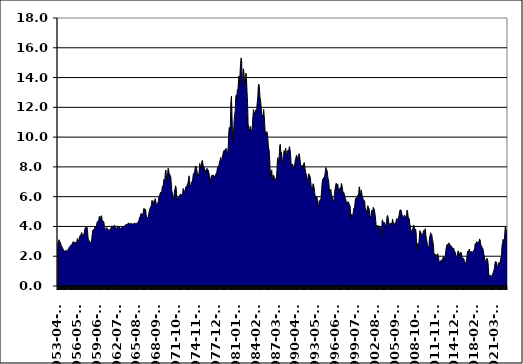
| Category | Series 0 |
|---|---|
| 1953-04-01 | 2.83 |
| 1953-05-01 | 3.05 |
| 1953-06-01 | 3.11 |
| 1953-07-01 | 2.93 |
| 1953-08-01 | 2.95 |
| 1953-09-01 | 2.87 |
| 1953-10-01 | 2.66 |
| 1953-11-01 | 2.68 |
| 1953-12-01 | 2.59 |
| 1954-01-01 | 2.48 |
| 1954-02-01 | 2.47 |
| 1954-03-01 | 2.37 |
| 1954-04-01 | 2.29 |
| 1954-05-01 | 2.37 |
| 1954-06-01 | 2.38 |
| 1954-07-01 | 2.3 |
| 1954-08-01 | 2.36 |
| 1954-09-01 | 2.38 |
| 1954-10-01 | 2.43 |
| 1954-11-01 | 2.48 |
| 1954-12-01 | 2.51 |
| 1955-01-01 | 2.61 |
| 1955-02-01 | 2.65 |
| 1955-03-01 | 2.68 |
| 1955-04-01 | 2.75 |
| 1955-05-01 | 2.76 |
| 1955-06-01 | 2.78 |
| 1955-07-01 | 2.9 |
| 1955-08-01 | 2.97 |
| 1955-09-01 | 2.97 |
| 1955-10-01 | 2.88 |
| 1955-11-01 | 2.89 |
| 1955-12-01 | 2.96 |
| 1956-01-01 | 2.9 |
| 1956-02-01 | 2.84 |
| 1956-03-01 | 2.96 |
| 1956-04-01 | 3.18 |
| 1956-05-01 | 3.07 |
| 1956-06-01 | 3 |
| 1956-07-01 | 3.11 |
| 1956-08-01 | 3.33 |
| 1956-09-01 | 3.38 |
| 1956-10-01 | 3.34 |
| 1956-11-01 | 3.49 |
| 1956-12-01 | 3.59 |
| 1957-01-01 | 3.46 |
| 1957-02-01 | 3.34 |
| 1957-03-01 | 3.41 |
| 1957-04-01 | 3.48 |
| 1957-05-01 | 3.6 |
| 1957-06-01 | 3.8 |
| 1957-07-01 | 3.93 |
| 1957-08-01 | 3.93 |
| 1957-09-01 | 3.92 |
| 1957-10-01 | 3.97 |
| 1957-11-01 | 3.72 |
| 1957-12-01 | 3.21 |
| 1958-01-01 | 3.09 |
| 1958-02-01 | 3.05 |
| 1958-03-01 | 2.98 |
| 1958-04-01 | 2.88 |
| 1958-05-01 | 2.92 |
| 1958-06-01 | 2.97 |
| 1958-07-01 | 3.2 |
| 1958-08-01 | 3.54 |
| 1958-09-01 | 3.76 |
| 1958-10-01 | 3.8 |
| 1958-11-01 | 3.74 |
| 1958-12-01 | 3.86 |
| 1959-01-01 | 4.02 |
| 1959-02-01 | 3.96 |
| 1959-03-01 | 3.99 |
| 1959-04-01 | 4.12 |
| 1959-05-01 | 4.31 |
| 1959-06-01 | 4.34 |
| 1959-07-01 | 4.4 |
| 1959-08-01 | 4.43 |
| 1959-09-01 | 4.68 |
| 1959-10-01 | 4.53 |
| 1959-11-01 | 4.53 |
| 1959-12-01 | 4.69 |
| 1960-01-01 | 4.72 |
| 1960-02-01 | 4.49 |
| 1960-03-01 | 4.25 |
| 1960-04-01 | 4.28 |
| 1960-05-01 | 4.35 |
| 1960-06-01 | 4.15 |
| 1960-07-01 | 3.9 |
| 1960-08-01 | 3.8 |
| 1960-09-01 | 3.8 |
| 1960-10-01 | 3.89 |
| 1960-11-01 | 3.93 |
| 1960-12-01 | 3.84 |
| 1961-01-01 | 3.84 |
| 1961-02-01 | 3.78 |
| 1961-03-01 | 3.74 |
| 1961-04-01 | 3.78 |
| 1961-05-01 | 3.71 |
| 1961-06-01 | 3.88 |
| 1961-07-01 | 3.92 |
| 1961-08-01 | 4.04 |
| 1961-09-01 | 3.98 |
| 1961-10-01 | 3.92 |
| 1961-11-01 | 3.94 |
| 1961-12-01 | 4.06 |
| 1962-01-01 | 4.08 |
| 1962-02-01 | 4.04 |
| 1962-03-01 | 3.93 |
| 1962-04-01 | 3.84 |
| 1962-05-01 | 3.87 |
| 1962-06-01 | 3.91 |
| 1962-07-01 | 4.01 |
| 1962-08-01 | 3.98 |
| 1962-09-01 | 3.98 |
| 1962-10-01 | 3.93 |
| 1962-11-01 | 3.92 |
| 1962-12-01 | 3.86 |
| 1963-01-01 | 3.83 |
| 1963-02-01 | 3.92 |
| 1963-03-01 | 3.93 |
| 1963-04-01 | 3.97 |
| 1963-05-01 | 3.93 |
| 1963-06-01 | 3.99 |
| 1963-07-01 | 4.02 |
| 1963-08-01 | 4 |
| 1963-09-01 | 4.08 |
| 1963-10-01 | 4.11 |
| 1963-11-01 | 4.12 |
| 1963-12-01 | 4.13 |
| 1964-01-01 | 4.17 |
| 1964-02-01 | 4.15 |
| 1964-03-01 | 4.22 |
| 1964-04-01 | 4.23 |
| 1964-05-01 | 4.2 |
| 1964-06-01 | 4.17 |
| 1964-07-01 | 4.19 |
| 1964-08-01 | 4.19 |
| 1964-09-01 | 4.2 |
| 1964-10-01 | 4.19 |
| 1964-11-01 | 4.15 |
| 1964-12-01 | 4.18 |
| 1965-01-01 | 4.19 |
| 1965-02-01 | 4.21 |
| 1965-03-01 | 4.21 |
| 1965-04-01 | 4.2 |
| 1965-05-01 | 4.21 |
| 1965-06-01 | 4.21 |
| 1965-07-01 | 4.2 |
| 1965-08-01 | 4.25 |
| 1965-09-01 | 4.29 |
| 1965-10-01 | 4.35 |
| 1965-11-01 | 4.45 |
| 1965-12-01 | 4.62 |
| 1966-01-01 | 4.61 |
| 1966-02-01 | 4.83 |
| 1966-03-01 | 4.87 |
| 1966-04-01 | 4.75 |
| 1966-05-01 | 4.78 |
| 1966-06-01 | 4.81 |
| 1966-07-01 | 5.02 |
| 1966-08-01 | 5.22 |
| 1966-09-01 | 5.18 |
| 1966-10-01 | 5.01 |
| 1966-11-01 | 5.16 |
| 1966-12-01 | 4.84 |
| 1967-01-01 | 4.58 |
| 1967-02-01 | 4.63 |
| 1967-03-01 | 4.54 |
| 1967-04-01 | 4.59 |
| 1967-05-01 | 4.85 |
| 1967-06-01 | 5.02 |
| 1967-07-01 | 5.16 |
| 1967-08-01 | 5.28 |
| 1967-09-01 | 5.3 |
| 1967-10-01 | 5.48 |
| 1967-11-01 | 5.75 |
| 1967-12-01 | 5.7 |
| 1968-01-01 | 5.53 |
| 1968-02-01 | 5.56 |
| 1968-03-01 | 5.74 |
| 1968-04-01 | 5.64 |
| 1968-05-01 | 5.87 |
| 1968-06-01 | 5.72 |
| 1968-07-01 | 5.5 |
| 1968-08-01 | 5.42 |
| 1968-09-01 | 5.46 |
| 1968-10-01 | 5.58 |
| 1968-11-01 | 5.7 |
| 1968-12-01 | 6.03 |
| 1969-01-01 | 6.04 |
| 1969-02-01 | 6.19 |
| 1969-03-01 | 6.3 |
| 1969-04-01 | 6.17 |
| 1969-05-01 | 6.32 |
| 1969-06-01 | 6.57 |
| 1969-07-01 | 6.72 |
| 1969-08-01 | 6.69 |
| 1969-09-01 | 7.16 |
| 1969-10-01 | 7.1 |
| 1969-11-01 | 7.14 |
| 1969-12-01 | 7.65 |
| 1970-01-01 | 7.79 |
| 1970-02-01 | 7.24 |
| 1970-03-01 | 7.07 |
| 1970-04-01 | 7.39 |
| 1970-05-01 | 7.91 |
| 1970-06-01 | 7.84 |
| 1970-07-01 | 7.46 |
| 1970-08-01 | 7.53 |
| 1970-09-01 | 7.39 |
| 1970-10-01 | 7.33 |
| 1970-11-01 | 6.84 |
| 1970-12-01 | 6.39 |
| 1971-01-01 | 6.24 |
| 1971-02-01 | 6.11 |
| 1971-03-01 | 5.7 |
| 1971-04-01 | 5.83 |
| 1971-05-01 | 6.39 |
| 1971-06-01 | 6.52 |
| 1971-07-01 | 6.73 |
| 1971-08-01 | 6.58 |
| 1971-09-01 | 6.14 |
| 1971-10-01 | 5.93 |
| 1971-11-01 | 5.81 |
| 1971-12-01 | 5.93 |
| 1972-01-01 | 5.95 |
| 1972-02-01 | 6.08 |
| 1972-03-01 | 6.07 |
| 1972-04-01 | 6.19 |
| 1972-05-01 | 6.13 |
| 1972-06-01 | 6.11 |
| 1972-07-01 | 6.11 |
| 1972-08-01 | 6.21 |
| 1972-09-01 | 6.55 |
| 1972-10-01 | 6.48 |
| 1972-11-01 | 6.28 |
| 1972-12-01 | 6.36 |
| 1973-01-01 | 6.46 |
| 1973-02-01 | 6.64 |
| 1973-03-01 | 6.71 |
| 1973-04-01 | 6.67 |
| 1973-05-01 | 6.85 |
| 1973-06-01 | 6.9 |
| 1973-07-01 | 7.13 |
| 1973-08-01 | 7.4 |
| 1973-09-01 | 7.09 |
| 1973-10-01 | 6.79 |
| 1973-11-01 | 6.73 |
| 1973-12-01 | 6.74 |
| 1974-01-01 | 6.99 |
| 1974-02-01 | 6.96 |
| 1974-03-01 | 7.21 |
| 1974-04-01 | 7.51 |
| 1974-05-01 | 7.58 |
| 1974-06-01 | 7.54 |
| 1974-07-01 | 7.81 |
| 1974-08-01 | 8.04 |
| 1974-09-01 | 8.04 |
| 1974-10-01 | 7.9 |
| 1974-11-01 | 7.68 |
| 1974-12-01 | 7.43 |
| 1975-01-01 | 7.5 |
| 1975-02-01 | 7.39 |
| 1975-03-01 | 7.73 |
| 1975-04-01 | 8.23 |
| 1975-05-01 | 8.06 |
| 1975-06-01 | 7.86 |
| 1975-07-01 | 8.06 |
| 1975-08-01 | 8.4 |
| 1975-09-01 | 8.43 |
| 1975-10-01 | 8.14 |
| 1975-11-01 | 8.05 |
| 1975-12-01 | 8 |
| 1976-01-01 | 7.74 |
| 1976-02-01 | 7.79 |
| 1976-03-01 | 7.73 |
| 1976-04-01 | 7.56 |
| 1976-05-01 | 7.9 |
| 1976-06-01 | 7.86 |
| 1976-07-01 | 7.83 |
| 1976-08-01 | 7.77 |
| 1976-09-01 | 7.59 |
| 1976-10-01 | 7.41 |
| 1976-11-01 | 7.29 |
| 1976-12-01 | 6.87 |
| 1977-01-01 | 7.21 |
| 1977-02-01 | 7.39 |
| 1977-03-01 | 7.46 |
| 1977-04-01 | 7.37 |
| 1977-05-01 | 7.46 |
| 1977-06-01 | 7.28 |
| 1977-07-01 | 7.33 |
| 1977-08-01 | 7.4 |
| 1977-09-01 | 7.34 |
| 1977-10-01 | 7.52 |
| 1977-11-01 | 7.58 |
| 1977-12-01 | 7.69 |
| 1978-01-01 | 7.96 |
| 1978-02-01 | 8.03 |
| 1978-03-01 | 8.04 |
| 1978-04-01 | 8.15 |
| 1978-05-01 | 8.35 |
| 1978-06-01 | 8.46 |
| 1978-07-01 | 8.64 |
| 1978-08-01 | 8.41 |
| 1978-09-01 | 8.42 |
| 1978-10-01 | 8.64 |
| 1978-11-01 | 8.81 |
| 1978-12-01 | 9.01 |
| 1979-01-01 | 9.1 |
| 1979-02-01 | 9.1 |
| 1979-03-01 | 9.12 |
| 1979-04-01 | 9.18 |
| 1979-05-01 | 9.25 |
| 1979-06-01 | 8.91 |
| 1979-07-01 | 8.95 |
| 1979-08-01 | 9.03 |
| 1979-09-01 | 9.33 |
| 1979-10-01 | 10.3 |
| 1979-11-01 | 10.65 |
| 1979-12-01 | 10.39 |
| 1980-01-01 | 10.8 |
| 1980-02-01 | 12.41 |
| 1980-03-01 | 12.75 |
| 1980-04-01 | 11.47 |
| 1980-05-01 | 10.18 |
| 1980-06-01 | 9.78 |
| 1980-07-01 | 10.25 |
| 1980-08-01 | 11.1 |
| 1980-09-01 | 11.51 |
| 1980-10-01 | 11.75 |
| 1980-11-01 | 12.68 |
| 1980-12-01 | 12.84 |
| 1981-01-01 | 12.57 |
| 1981-02-01 | 13.19 |
| 1981-03-01 | 13.12 |
| 1981-04-01 | 13.68 |
| 1981-05-01 | 14.1 |
| 1981-06-01 | 13.47 |
| 1981-07-01 | 14.28 |
| 1981-08-01 | 14.94 |
| 1981-09-01 | 15.32 |
| 1981-10-01 | 15.15 |
| 1981-11-01 | 13.39 |
| 1981-12-01 | 13.72 |
| 1982-01-01 | 14.59 |
| 1982-02-01 | 14.43 |
| 1982-03-01 | 13.86 |
| 1982-04-01 | 13.87 |
| 1982-05-01 | 13.62 |
| 1982-06-01 | 14.3 |
| 1982-07-01 | 13.95 |
| 1982-08-01 | 13.06 |
| 1982-09-01 | 12.34 |
| 1982-10-01 | 10.91 |
| 1982-11-01 | 10.55 |
| 1982-12-01 | 10.54 |
| 1983-01-01 | 10.46 |
| 1983-02-01 | 10.72 |
| 1983-03-01 | 10.51 |
| 1983-04-01 | 10.4 |
| 1983-05-01 | 10.38 |
| 1983-06-01 | 10.85 |
| 1983-07-01 | 11.38 |
| 1983-08-01 | 11.85 |
| 1983-09-01 | 11.65 |
| 1983-10-01 | 11.54 |
| 1983-11-01 | 11.69 |
| 1983-12-01 | 11.83 |
| 1984-01-01 | 11.67 |
| 1984-02-01 | 11.84 |
| 1984-03-01 | 12.32 |
| 1984-04-01 | 12.63 |
| 1984-05-01 | 13.41 |
| 1984-06-01 | 13.56 |
| 1984-07-01 | 13.36 |
| 1984-08-01 | 12.72 |
| 1984-09-01 | 12.52 |
| 1984-10-01 | 12.16 |
| 1984-11-01 | 11.57 |
| 1984-12-01 | 11.5 |
| 1985-01-01 | 11.38 |
| 1985-02-01 | 11.51 |
| 1985-03-01 | 11.86 |
| 1985-04-01 | 11.43 |
| 1985-05-01 | 10.85 |
| 1985-06-01 | 10.16 |
| 1985-07-01 | 10.31 |
| 1985-08-01 | 10.33 |
| 1985-09-01 | 10.37 |
| 1985-10-01 | 10.24 |
| 1985-11-01 | 9.78 |
| 1985-12-01 | 9.26 |
| 1986-01-01 | 9.19 |
| 1986-02-01 | 8.7 |
| 1986-03-01 | 7.78 |
| 1986-04-01 | 7.3 |
| 1986-05-01 | 7.71 |
| 1986-06-01 | 7.8 |
| 1986-07-01 | 7.3 |
| 1986-08-01 | 7.17 |
| 1986-09-01 | 7.45 |
| 1986-10-01 | 7.43 |
| 1986-11-01 | 7.25 |
| 1986-12-01 | 7.11 |
| 1987-01-01 | 7.08 |
| 1987-02-01 | 7.25 |
| 1987-03-01 | 7.25 |
| 1987-04-01 | 8.02 |
| 1987-05-01 | 8.61 |
| 1987-06-01 | 8.4 |
| 1987-07-01 | 8.45 |
| 1987-08-01 | 8.76 |
| 1987-09-01 | 9.42 |
| 1987-10-01 | 9.52 |
| 1987-11-01 | 8.86 |
| 1987-12-01 | 8.99 |
| 1988-01-01 | 8.67 |
| 1988-02-01 | 8.21 |
| 1988-03-01 | 8.37 |
| 1988-04-01 | 8.72 |
| 1988-05-01 | 9.09 |
| 1988-06-01 | 8.92 |
| 1988-07-01 | 9.06 |
| 1988-08-01 | 9.26 |
| 1988-09-01 | 8.98 |
| 1988-10-01 | 8.8 |
| 1988-11-01 | 8.96 |
| 1988-12-01 | 9.11 |
| 1989-01-01 | 9.09 |
| 1989-02-01 | 9.17 |
| 1989-03-01 | 9.36 |
| 1989-04-01 | 9.18 |
| 1989-05-01 | 8.86 |
| 1989-06-01 | 8.28 |
| 1989-07-01 | 8.02 |
| 1989-08-01 | 8.11 |
| 1989-09-01 | 8.19 |
| 1989-10-01 | 8.01 |
| 1989-11-01 | 7.87 |
| 1989-12-01 | 7.84 |
| 1990-01-01 | 8.21 |
| 1990-02-01 | 8.47 |
| 1990-03-01 | 8.59 |
| 1990-04-01 | 8.79 |
| 1990-05-01 | 8.76 |
| 1990-06-01 | 8.48 |
| 1990-07-01 | 8.47 |
| 1990-08-01 | 8.75 |
| 1990-09-01 | 8.89 |
| 1990-10-01 | 8.72 |
| 1990-11-01 | 8.39 |
| 1990-12-01 | 8.08 |
| 1991-01-01 | 8.09 |
| 1991-02-01 | 7.85 |
| 1991-03-01 | 8.11 |
| 1991-04-01 | 8.04 |
| 1991-05-01 | 8.07 |
| 1991-06-01 | 8.28 |
| 1991-07-01 | 8.27 |
| 1991-08-01 | 7.9 |
| 1991-09-01 | 7.65 |
| 1991-10-01 | 7.53 |
| 1991-11-01 | 7.42 |
| 1991-12-01 | 7.09 |
| 1992-01-01 | 7.03 |
| 1992-02-01 | 7.34 |
| 1992-03-01 | 7.54 |
| 1992-04-01 | 7.48 |
| 1992-05-01 | 7.39 |
| 1992-06-01 | 7.26 |
| 1992-07-01 | 6.84 |
| 1992-08-01 | 6.59 |
| 1992-09-01 | 6.42 |
| 1992-10-01 | 6.59 |
| 1992-11-01 | 6.87 |
| 1992-12-01 | 6.77 |
| 1993-01-01 | 6.6 |
| 1993-02-01 | 6.26 |
| 1993-03-01 | 5.98 |
| 1993-04-01 | 5.97 |
| 1993-05-01 | 6.04 |
| 1993-06-01 | 5.96 |
| 1993-07-01 | 5.81 |
| 1993-08-01 | 5.68 |
| 1993-09-01 | 5.36 |
| 1993-10-01 | 5.33 |
| 1993-11-01 | 5.72 |
| 1993-12-01 | 5.77 |
| 1994-01-01 | 5.75 |
| 1994-02-01 | 5.97 |
| 1994-03-01 | 6.48 |
| 1994-04-01 | 6.97 |
| 1994-05-01 | 7.18 |
| 1994-06-01 | 7.1 |
| 1994-07-01 | 7.3 |
| 1994-08-01 | 7.24 |
| 1994-09-01 | 7.46 |
| 1994-10-01 | 7.74 |
| 1994-11-01 | 7.96 |
| 1994-12-01 | 7.81 |
| 1995-01-01 | 7.78 |
| 1995-02-01 | 7.47 |
| 1995-03-01 | 7.2 |
| 1995-04-01 | 7.06 |
| 1995-05-01 | 6.63 |
| 1995-06-01 | 6.17 |
| 1995-07-01 | 6.28 |
| 1995-08-01 | 6.49 |
| 1995-09-01 | 6.2 |
| 1995-10-01 | 6.04 |
| 1995-11-01 | 5.93 |
| 1995-12-01 | 5.71 |
| 1996-01-01 | 5.65 |
| 1996-02-01 | 5.81 |
| 1996-03-01 | 6.27 |
| 1996-04-01 | 6.51 |
| 1996-05-01 | 6.74 |
| 1996-06-01 | 6.91 |
| 1996-07-01 | 6.87 |
| 1996-08-01 | 6.64 |
| 1996-09-01 | 6.83 |
| 1996-10-01 | 6.53 |
| 1996-11-01 | 6.2 |
| 1996-12-01 | 6.3 |
| 1997-01-01 | 6.58 |
| 1997-02-01 | 6.42 |
| 1997-03-01 | 6.69 |
| 1997-04-01 | 6.89 |
| 1997-05-01 | 6.71 |
| 1997-06-01 | 6.49 |
| 1997-07-01 | 6.22 |
| 1997-08-01 | 6.3 |
| 1997-09-01 | 6.21 |
| 1997-10-01 | 6.03 |
| 1997-11-01 | 5.88 |
| 1997-12-01 | 5.81 |
| 1998-01-01 | 5.54 |
| 1998-02-01 | 5.57 |
| 1998-03-01 | 5.65 |
| 1998-04-01 | 5.64 |
| 1998-05-01 | 5.65 |
| 1998-06-01 | 5.5 |
| 1998-07-01 | 5.46 |
| 1998-08-01 | 5.34 |
| 1998-09-01 | 4.81 |
| 1998-10-01 | 4.53 |
| 1998-11-01 | 4.83 |
| 1998-12-01 | 4.65 |
| 1999-01-01 | 4.72 |
| 1999-02-01 | 5 |
| 1999-03-01 | 5.23 |
| 1999-04-01 | 5.18 |
| 1999-05-01 | 5.54 |
| 1999-06-01 | 5.9 |
| 1999-07-01 | 5.79 |
| 1999-08-01 | 5.94 |
| 1999-09-01 | 5.92 |
| 1999-10-01 | 6.11 |
| 1999-11-01 | 6.03 |
| 1999-12-01 | 6.28 |
| 2000-01-01 | 6.66 |
| 2000-02-01 | 6.52 |
| 2000-03-01 | 6.26 |
| 2000-04-01 | 5.99 |
| 2000-05-01 | 6.44 |
| 2000-06-01 | 6.1 |
| 2000-07-01 | 6.05 |
| 2000-08-01 | 5.83 |
| 2000-09-01 | 5.8 |
| 2000-10-01 | 5.74 |
| 2000-11-01 | 5.72 |
| 2000-12-01 | 5.24 |
| 2001-01-01 | 5.16 |
| 2001-02-01 | 5.1 |
| 2001-03-01 | 4.89 |
| 2001-04-01 | 5.14 |
| 2001-05-01 | 5.39 |
| 2001-06-01 | 5.28 |
| 2001-07-01 | 5.24 |
| 2001-08-01 | 4.97 |
| 2001-09-01 | 4.73 |
| 2001-10-01 | 4.57 |
| 2001-11-01 | 4.65 |
| 2001-12-01 | 5.09 |
| 2002-01-01 | 5.04 |
| 2002-02-01 | 4.91 |
| 2002-03-01 | 5.28 |
| 2002-04-01 | 5.21 |
| 2002-05-01 | 5.16 |
| 2002-06-01 | 4.93 |
| 2002-07-01 | 4.65 |
| 2002-08-01 | 4.26 |
| 2002-09-01 | 3.87 |
| 2002-10-01 | 3.94 |
| 2002-11-01 | 4.05 |
| 2002-12-01 | 4.03 |
| 2003-01-01 | 4.05 |
| 2003-02-01 | 3.9 |
| 2003-03-01 | 3.81 |
| 2003-04-01 | 3.96 |
| 2003-05-01 | 3.57 |
| 2003-06-01 | 3.33 |
| 2003-07-01 | 3.98 |
| 2003-08-01 | 4.45 |
| 2003-09-01 | 4.27 |
| 2003-10-01 | 4.29 |
| 2003-11-01 | 4.3 |
| 2003-12-01 | 4.27 |
| 2004-01-01 | 4.15 |
| 2004-02-01 | 4.08 |
| 2004-03-01 | 3.98 |
| 2004-04-01 | 4.35 |
| 2004-05-01 | 4.72 |
| 2004-06-01 | 4.73 |
| 2004-07-01 | 4.5 |
| 2004-08-01 | 4.28 |
| 2004-09-01 | 4.13 |
| 2004-10-01 | 4.1 |
| 2004-11-01 | 4.19 |
| 2004-12-01 | 4.23 |
| 2005-01-01 | 4.22 |
| 2005-02-01 | 4.17 |
| 2005-03-01 | 4.5 |
| 2005-04-01 | 4.34 |
| 2005-05-01 | 4.14 |
| 2005-06-01 | 4 |
| 2005-07-01 | 4.18 |
| 2005-08-01 | 4.26 |
| 2005-09-01 | 4.2 |
| 2005-10-01 | 4.46 |
| 2005-11-01 | 4.54 |
| 2005-12-01 | 4.47 |
| 2006-01-01 | 4.42 |
| 2006-02-01 | 4.57 |
| 2006-03-01 | 4.72 |
| 2006-04-01 | 4.99 |
| 2006-05-01 | 5.11 |
| 2006-06-01 | 5.11 |
| 2006-07-01 | 5.09 |
| 2006-08-01 | 4.88 |
| 2006-09-01 | 4.72 |
| 2006-10-01 | 4.73 |
| 2006-11-01 | 4.6 |
| 2006-12-01 | 4.56 |
| 2007-01-01 | 4.76 |
| 2007-02-01 | 4.72 |
| 2007-03-01 | 4.56 |
| 2007-04-01 | 4.69 |
| 2007-05-01 | 4.75 |
| 2007-06-01 | 5.1 |
| 2007-07-01 | 5 |
| 2007-08-01 | 4.67 |
| 2007-09-01 | 4.52 |
| 2007-10-01 | 4.53 |
| 2007-11-01 | 4.15 |
| 2007-12-01 | 4.1 |
| 2008-01-01 | 3.74 |
| 2008-02-01 | 3.74 |
| 2008-03-01 | 3.51 |
| 2008-04-01 | 3.68 |
| 2008-05-01 | 3.88 |
| 2008-06-01 | 4.1 |
| 2008-07-01 | 4.01 |
| 2008-08-01 | 3.89 |
| 2008-09-01 | 3.69 |
| 2008-10-01 | 3.81 |
| 2008-11-01 | 3.53 |
| 2008-12-01 | 2.42 |
| 2009-01-01 | 2.52 |
| 2009-02-01 | 2.87 |
| 2009-03-01 | 2.82 |
| 2009-04-01 | 2.93 |
| 2009-05-01 | 3.29 |
| 2009-06-01 | 3.72 |
| 2009-07-01 | 3.56 |
| 2009-08-01 | 3.59 |
| 2009-09-01 | 3.4 |
| 2009-10-01 | 3.39 |
| 2009-11-01 | 3.4 |
| 2009-12-01 | 3.59 |
| 2010-01-01 | 3.73 |
| 2010-02-01 | 3.69 |
| 2010-03-01 | 3.73 |
| 2010-04-01 | 3.85 |
| 2010-05-01 | 3.42 |
| 2010-06-01 | 3.2 |
| 2010-07-01 | 3.01 |
| 2010-08-01 | 2.7 |
| 2010-09-01 | 2.6 |
| 2010-10-01 | 2.54 |
| 2010-11-01 | 2.76 |
| 2010-12-01 | 3.29 |
| 2011-01-01 | 3.39 |
| 2011-02-01 | 3.58 |
| 2011-03-01 | 3.41 |
| 2011-04-01 | 3.46 |
| 2011-05-01 | 3.17 |
| 2011-06-01 | 3 |
| 2011-07-01 | 2.8 |
| 2011-08-01 | 2.25 |
| 2011-09-01 | 2 |
| 2011-10-01 | 2.15 |
| 2011-11-01 | 2.05 |
| 2011-12-01 | 2.11 |
| 2012-01-01 | 1.97 |
| 2012-02-01 | 1.97 |
| 2012-03-01 | 2.17 |
| 2012-04-01 | 2.05 |
| 2012-05-01 | 1.8 |
| 2012-06-01 | 1.62 |
| 2012-07-01 | 1.53 |
| 2012-08-01 | 1.68 |
| 2012-09-01 | 1.72 |
| 2012-10-01 | 1.75 |
| 2012-11-01 | 1.65 |
| 2012-12-01 | 1.72 |
| 2013-01-01 | 1.91 |
| 2013-02-01 | 1.98 |
| 2013-03-01 | 1.96 |
| 2013-04-01 | 1.76 |
| 2013-05-01 | 1.93 |
| 2013-06-01 | 2.3 |
| 2013-07-01 | 2.58 |
| 2013-08-01 | 2.74 |
| 2013-09-01 | 2.81 |
| 2013-10-01 | 2.62 |
| 2013-11-01 | 2.72 |
| 2013-12-01 | 2.9 |
| 2014-01-01 | 2.86 |
| 2014-02-01 | 2.71 |
| 2014-03-01 | 2.72 |
| 2014-04-01 | 2.71 |
| 2014-05-01 | 2.56 |
| 2014-06-01 | 2.6 |
| 2014-07-01 | 2.54 |
| 2014-08-01 | 2.42 |
| 2014-09-01 | 2.53 |
| 2014-10-01 | 2.3 |
| 2014-11-01 | 2.33 |
| 2014-12-01 | 2.21 |
| 2015-02-01 | 1.98 |
| 2015-03-01 | 1.88 |
| 2015-04-01 | 1.94 |
| 2015-05-01 | 2.2 |
| 2015-06-01 | 2.36 |
| 2015-07-01 | 2.32 |
| 2015-08-01 | 2.17 |
| 2015-09-01 | 2.17 |
| 2015-10-01 | 2.07 |
| 2015-11-01 | 2.26 |
| 2015-12-01 | 2.24 |
| 2016-01-01 | 2 |
| 2016-02-01 | 1.78 |
| 2016-03-01 | 1.89 |
| 2016-04-01 | 1.81 |
| 2016-05-01 | 1.81 |
| 2016-06-01 | 1.64 |
| 2016-07-01 | 1.5 |
| 2016-08-01 | 1.56 |
| 2016-09-01 | 1.63 |
| 2016-10-01 | 1.76 |
| 2016-11-01 | 2.14 |
| 2016-12-01 | 2.34 |
| 2017-01-01 | 2.28 |
| 2017-02-01 | 2.4 |
| 2017-03-01 | 2.48 |
| 2017-04-01 | 2.3 |
| 2017-05-01 | 2.304 |
| 2017-06-01 | 2.187 |
| 2017-07-01 | 2.318 |
| 2017-08-01 | 2.209 |
| 2017-09-01 | 2.202 |
| 2017-10-01 | 2.36 |
| 2017-11-01 | 2.353 |
| 2017-12-01 | 2.402 |
| 2018-01-01 | 2.584 |
| 2018-02-01 | 2.859 |
| 2018-03-01 | 2.842 |
| 2018-04-01 | 2.869 |
| 2018-05-01 | 2.978 |
| 2018-06-01 | 2.912 |
| 2018-07-01 | 2.889 |
| 2018-08-01 | 2.889 |
| 2018-09-01 | 3.004 |
| 2018-10-01 | 3.152 |
| 2018-11-01 | 3.117 |
| 2018-12-01 | 2.833 |
| 2019-01-01 | 2.714 |
| 2019-02-01 | 2.676 |
| 2019-03-01 | 2.571 |
| 2019-04-01 | 2.532 |
| 2019-05-01 | 2.395 |
| 2019-06-01 | 2.074 |
| 2019-07-01 | 2.059 |
| 2019-08-01 | 1.626 |
| 2019-09-01 | 1.7 |
| 2019-10-01 | 1.707 |
| 2019-11-01 | 1.812 |
| 2019-12-01 | 1.863 |
| 2020-01-01 | 1.758 |
| 2020-02-01 | 1.504 |
| 2020-03-01 | 0.87 |
| 2020-04-01 | 0.658 |
| 2020-05-01 | 0.674 |
| 2020-06-01 | 0.729 |
| 2020-07-01 | 0.624 |
| 2020-08-01 | 0.65 |
| 2020-09-01 | 0.68 |
| 2020-10-01 | 0.787 |
| 2020-11-01 | 0.87 |
| 2020-12-01 | 0.934 |
| 2021-01-01 | 1.081 |
| 2021-02-01 | 1.258 |
| 2021-03-01 | 1.611 |
| 2021-04-01 | 1.635 |
| 2021-05-01 | 1.621 |
| 2021-06-01 | 1.519 |
| 2021-07-01 | 1.319 |
| 2021-08-01 | 1.283 |
| 2021-09-01 | 1.375 |
| 2021-10-01 | 1.582 |
| 2021-11-01 | 1.56 |
| 2021-12-01 | 1.465 |
| 2022-01-01 | 1.76 |
| 2022-02-01 | 1.93 |
| 2022-03-01 | 2.13 |
| 2022-04-01 | 2.75 |
| 2022-05-01 | 2.9 |
| 2022-06-01 | 3.14 |
| 2022-07-01 | 2.9 |
| 2022-08-01 | 2.9 |
| 2022-09-01 | 3.52 |
| 2022-10-01 | 3.98 |
| 2022-11-01 | 3.89 |
| 2022-12-01 | 3.6 |
| 2022-01-01 | 3.53 |
| 2022-02-01 | 3.75 |
| 2022-03-01 | 3.63 |